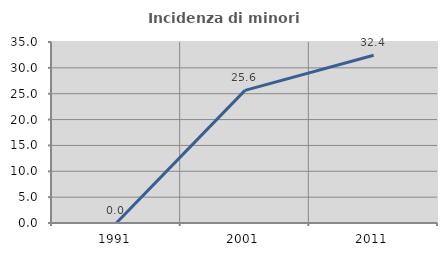
| Category | Incidenza di minori stranieri |
|---|---|
| 1991.0 | 0 |
| 2001.0 | 25.641 |
| 2011.0 | 32.432 |